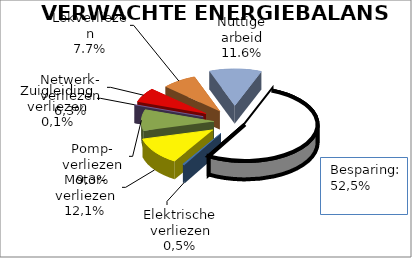
| Category | 5.3  VERWACHTE ENERGIEBALANS | Series 1 | Series 2 |
|---|---|---|---|
| Elektrische verliezen | 343.659 |  |  |
| Motorverliezen | 8947.376 |  |  |
| Pompverliezen | 6832.604 |  |  |
| Zuigleiding verliezen | 52.452 |  |  |
| Netwerkverliezen | 4652.843 |  |  |
| Lekverliezen | 5698.205 |  |  |
| Nuttige arbeid | 8547.308 |  |  |
| Besparing | 38576.496 |  |  |